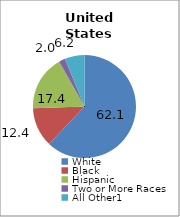
| Category | 50 states and D.C.2 |
|---|---|
| White | 62.056 |
| Black | 12.397 |
| Hispanic | 17.371 |
| Two or More Races | 2.004 |
| All Other1 | 6.173 |